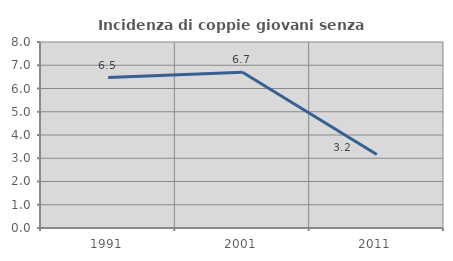
| Category | Incidenza di coppie giovani senza figli |
|---|---|
| 1991.0 | 6.47 |
| 2001.0 | 6.698 |
| 2011.0 | 3.159 |